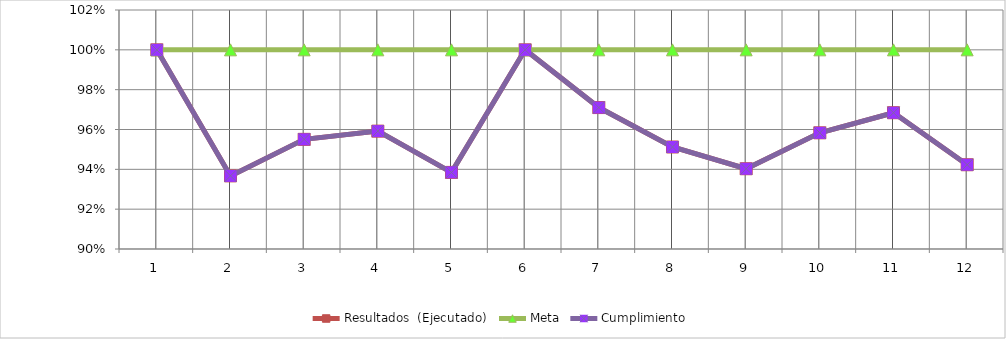
| Category | Resultados  (Ejecutado) | Meta | Cumplimiento |
|---|---|---|---|
| 0 | 1 | 1 | 1 |
| 1 | 0.937 | 1 | 0.937 |
| 2 | 0.955 | 1 | 0.955 |
| 3 | 0.959 | 1 | 0.959 |
| 4 | 0.938 | 1 | 0.938 |
| 5 | 1 | 1 | 1 |
| 6 | 0.971 | 1 | 0.971 |
| 7 | 0.951 | 1 | 0.951 |
| 8 | 0.94 | 1 | 0.94 |
| 9 | 0.958 | 1 | 0.958 |
| 10 | 0.968 | 1 | 0.968 |
| 11 | 0.942 | 1 | 0.942 |